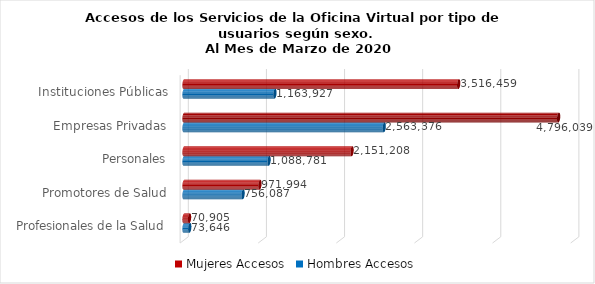
| Category | Mujeres | Hombres |
|---|---|---|
| Instituciones Públicas | 3516459 | 1163927 |
| Empresas Privadas | 4796039 | 2563376 |
| Personales | 2151208 | 1088781 |
| Promotores de Salud | 971994 | 756087 |
| Profesionales de la Salud | 70905 | 73646 |